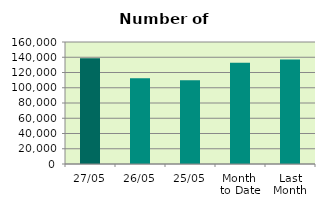
| Category | Series 0 |
|---|---|
| 27/05 | 138794 |
| 26/05 | 112474 |
| 25/05 | 109850 |
| Month 
to Date | 132694.632 |
| Last
Month | 137031.8 |